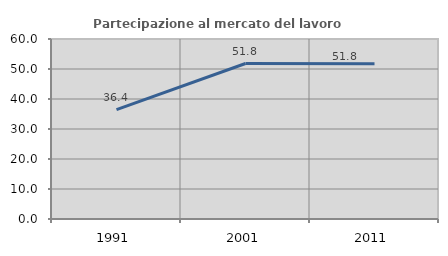
| Category | Partecipazione al mercato del lavoro  femminile |
|---|---|
| 1991.0 | 36.443 |
| 2001.0 | 51.831 |
| 2011.0 | 51.75 |